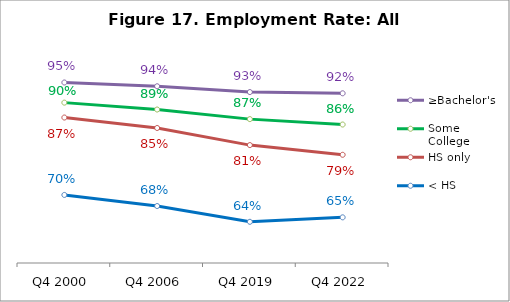
| Category | ≥Bachelor's | Some College | HS only | < HS |
|---|---|---|---|---|
| Q4 2000 | 0.948 | 0.903 | 0.87 | 0.7 |
| Q4 2006 | 0.939 | 0.888 | 0.847 | 0.675 |
| Q4 2019 | 0.926 | 0.867 | 0.81 | 0.641 |
| Q4 2022 | 0.924 | 0.855 | 0.788 | 0.651 |